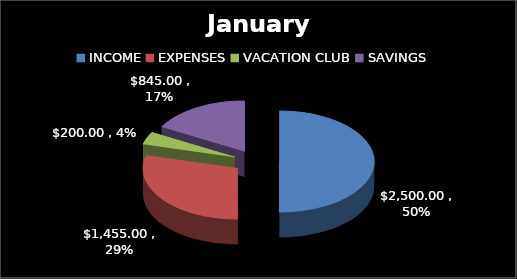
| Category | Series 0 |
|---|---|
| INCOME | 2500 |
| EXPENSES | 1455 |
| VACATION CLUB | 200 |
| SAVINGS | 845 |